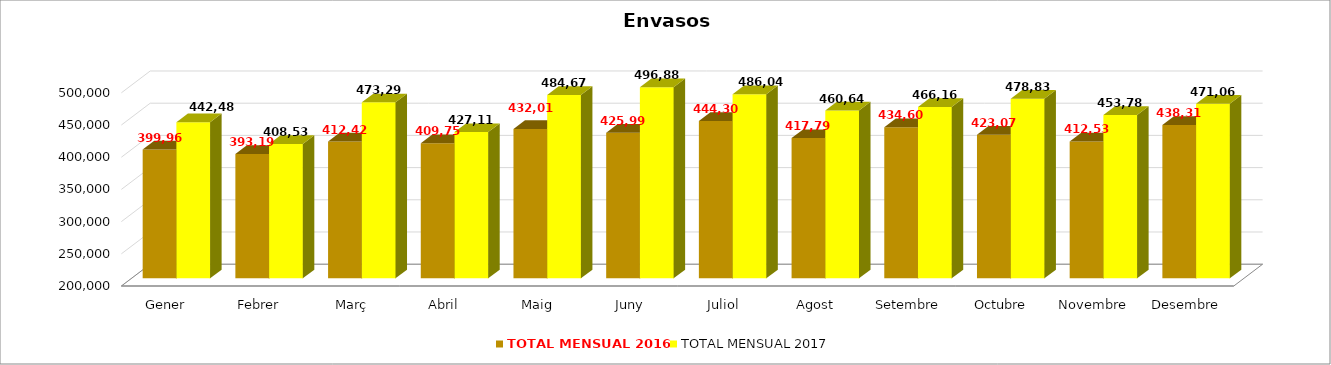
| Category | TOTAL MENSUAL 2016 | TOTAL MENSUAL 2017 |
|---|---|---|
| Gener | 399961.82 | 442484.61 |
| Febrer | 393197.91 | 408539.23 |
| Març | 412425.09 | 473297.3 |
| Abril | 409753.01 | 427112.19 |
| Maig | 432015.51 | 484674.07 |
| Juny | 425998.95 | 496882.85 |
| Juliol | 444307.12 | 486041.59 |
| Agost | 417796.44 | 460645.76 |
| Setembre | 434602.63 | 466163.29 |
| Octubre | 423074.09 | 478831.71 |
| Novembre | 412534.88 | 453783.78 |
| Desembre | 438311.22 | 471062.995 |